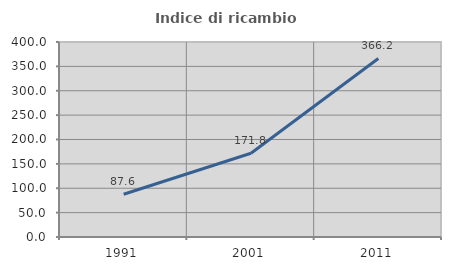
| Category | Indice di ricambio occupazionale  |
|---|---|
| 1991.0 | 87.601 |
| 2001.0 | 171.795 |
| 2011.0 | 366.222 |